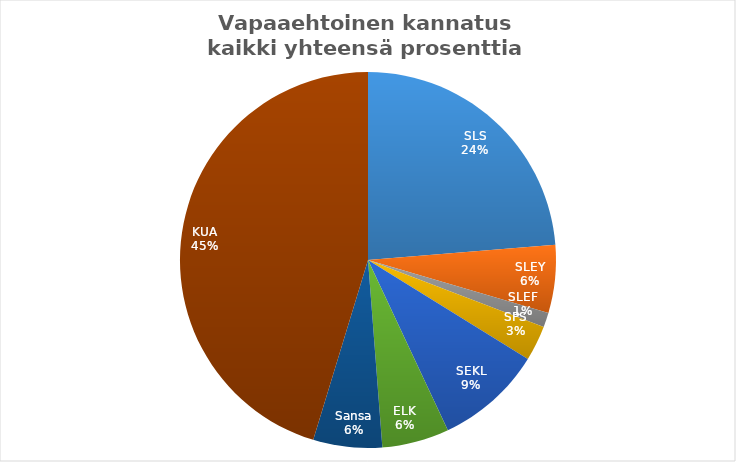
| Category | Series 0 |
|---|---|
| SLS | 23.708 |
| SLEY | 5.83 |
| SLEF | 1.26 |
| SPS | 3.026 |
| SEKL | 9.194 |
| ELK | 5.763 |
| Sansa | 5.924 |
| KUA | 45.294 |